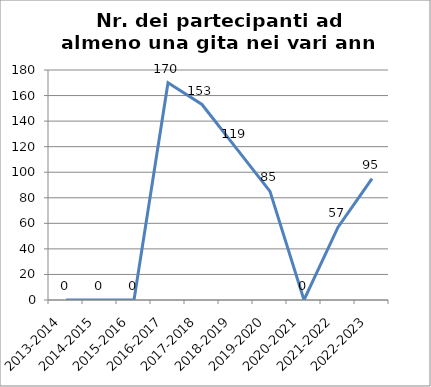
| Category | Nr. Partecipanti ad almeno una Gita |
|---|---|
| 2013-2014 | 0 |
| 2014-2015 | 0 |
| 2015-2016 | 0 |
| 2016-2017 | 170 |
| 2017-2018 | 153 |
| 2018-2019 | 119 |
| 2019-2020 | 85 |
| 2020-2021 | 0 |
| 2021-2022 | 57 |
| 2022-2023 | 95 |